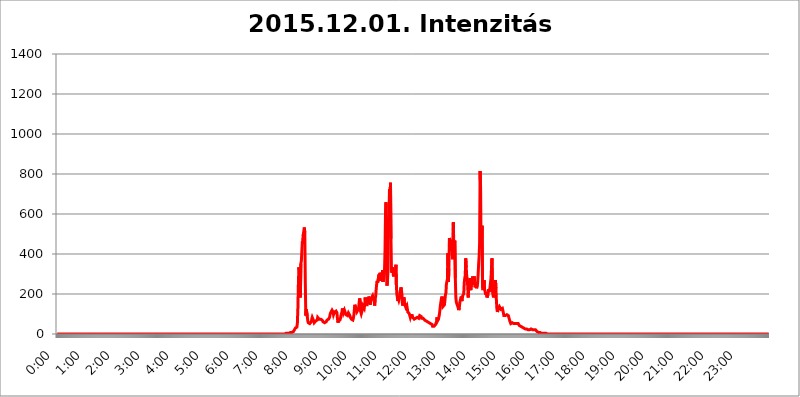
| Category | 2015.12.01. Intenzitás [W/m^2] |
|---|---|
| 0.0 | 0 |
| 0.0006944444444444445 | 0 |
| 0.001388888888888889 | 0 |
| 0.0020833333333333333 | 0 |
| 0.002777777777777778 | 0 |
| 0.003472222222222222 | 0 |
| 0.004166666666666667 | 0 |
| 0.004861111111111111 | 0 |
| 0.005555555555555556 | 0 |
| 0.0062499999999999995 | 0 |
| 0.006944444444444444 | 0 |
| 0.007638888888888889 | 0 |
| 0.008333333333333333 | 0 |
| 0.009027777777777779 | 0 |
| 0.009722222222222222 | 0 |
| 0.010416666666666666 | 0 |
| 0.011111111111111112 | 0 |
| 0.011805555555555555 | 0 |
| 0.012499999999999999 | 0 |
| 0.013194444444444444 | 0 |
| 0.013888888888888888 | 0 |
| 0.014583333333333332 | 0 |
| 0.015277777777777777 | 0 |
| 0.015972222222222224 | 0 |
| 0.016666666666666666 | 0 |
| 0.017361111111111112 | 0 |
| 0.018055555555555557 | 0 |
| 0.01875 | 0 |
| 0.019444444444444445 | 0 |
| 0.02013888888888889 | 0 |
| 0.020833333333333332 | 0 |
| 0.02152777777777778 | 0 |
| 0.022222222222222223 | 0 |
| 0.02291666666666667 | 0 |
| 0.02361111111111111 | 0 |
| 0.024305555555555556 | 0 |
| 0.024999999999999998 | 0 |
| 0.025694444444444447 | 0 |
| 0.02638888888888889 | 0 |
| 0.027083333333333334 | 0 |
| 0.027777777777777776 | 0 |
| 0.02847222222222222 | 0 |
| 0.029166666666666664 | 0 |
| 0.029861111111111113 | 0 |
| 0.030555555555555555 | 0 |
| 0.03125 | 0 |
| 0.03194444444444445 | 0 |
| 0.03263888888888889 | 0 |
| 0.03333333333333333 | 0 |
| 0.034027777777777775 | 0 |
| 0.034722222222222224 | 0 |
| 0.035416666666666666 | 0 |
| 0.036111111111111115 | 0 |
| 0.03680555555555556 | 0 |
| 0.0375 | 0 |
| 0.03819444444444444 | 0 |
| 0.03888888888888889 | 0 |
| 0.03958333333333333 | 0 |
| 0.04027777777777778 | 0 |
| 0.04097222222222222 | 0 |
| 0.041666666666666664 | 0 |
| 0.042361111111111106 | 0 |
| 0.04305555555555556 | 0 |
| 0.043750000000000004 | 0 |
| 0.044444444444444446 | 0 |
| 0.04513888888888889 | 0 |
| 0.04583333333333334 | 0 |
| 0.04652777777777778 | 0 |
| 0.04722222222222222 | 0 |
| 0.04791666666666666 | 0 |
| 0.04861111111111111 | 0 |
| 0.049305555555555554 | 0 |
| 0.049999999999999996 | 0 |
| 0.05069444444444445 | 0 |
| 0.051388888888888894 | 0 |
| 0.052083333333333336 | 0 |
| 0.05277777777777778 | 0 |
| 0.05347222222222222 | 0 |
| 0.05416666666666667 | 0 |
| 0.05486111111111111 | 0 |
| 0.05555555555555555 | 0 |
| 0.05625 | 0 |
| 0.05694444444444444 | 0 |
| 0.057638888888888885 | 0 |
| 0.05833333333333333 | 0 |
| 0.05902777777777778 | 0 |
| 0.059722222222222225 | 0 |
| 0.06041666666666667 | 0 |
| 0.061111111111111116 | 0 |
| 0.06180555555555556 | 0 |
| 0.0625 | 0 |
| 0.06319444444444444 | 0 |
| 0.06388888888888888 | 0 |
| 0.06458333333333334 | 0 |
| 0.06527777777777778 | 0 |
| 0.06597222222222222 | 0 |
| 0.06666666666666667 | 0 |
| 0.06736111111111111 | 0 |
| 0.06805555555555555 | 0 |
| 0.06874999999999999 | 0 |
| 0.06944444444444443 | 0 |
| 0.07013888888888889 | 0 |
| 0.07083333333333333 | 0 |
| 0.07152777777777779 | 0 |
| 0.07222222222222223 | 0 |
| 0.07291666666666667 | 0 |
| 0.07361111111111111 | 0 |
| 0.07430555555555556 | 0 |
| 0.075 | 0 |
| 0.07569444444444444 | 0 |
| 0.0763888888888889 | 0 |
| 0.07708333333333334 | 0 |
| 0.07777777777777778 | 0 |
| 0.07847222222222222 | 0 |
| 0.07916666666666666 | 0 |
| 0.0798611111111111 | 0 |
| 0.08055555555555556 | 0 |
| 0.08125 | 0 |
| 0.08194444444444444 | 0 |
| 0.08263888888888889 | 0 |
| 0.08333333333333333 | 0 |
| 0.08402777777777777 | 0 |
| 0.08472222222222221 | 0 |
| 0.08541666666666665 | 0 |
| 0.08611111111111112 | 0 |
| 0.08680555555555557 | 0 |
| 0.08750000000000001 | 0 |
| 0.08819444444444445 | 0 |
| 0.08888888888888889 | 0 |
| 0.08958333333333333 | 0 |
| 0.09027777777777778 | 0 |
| 0.09097222222222222 | 0 |
| 0.09166666666666667 | 0 |
| 0.09236111111111112 | 0 |
| 0.09305555555555556 | 0 |
| 0.09375 | 0 |
| 0.09444444444444444 | 0 |
| 0.09513888888888888 | 0 |
| 0.09583333333333333 | 0 |
| 0.09652777777777777 | 0 |
| 0.09722222222222222 | 0 |
| 0.09791666666666667 | 0 |
| 0.09861111111111111 | 0 |
| 0.09930555555555555 | 0 |
| 0.09999999999999999 | 0 |
| 0.10069444444444443 | 0 |
| 0.1013888888888889 | 0 |
| 0.10208333333333335 | 0 |
| 0.10277777777777779 | 0 |
| 0.10347222222222223 | 0 |
| 0.10416666666666667 | 0 |
| 0.10486111111111111 | 0 |
| 0.10555555555555556 | 0 |
| 0.10625 | 0 |
| 0.10694444444444444 | 0 |
| 0.1076388888888889 | 0 |
| 0.10833333333333334 | 0 |
| 0.10902777777777778 | 0 |
| 0.10972222222222222 | 0 |
| 0.1111111111111111 | 0 |
| 0.11180555555555556 | 0 |
| 0.11180555555555556 | 0 |
| 0.1125 | 0 |
| 0.11319444444444444 | 0 |
| 0.11388888888888889 | 0 |
| 0.11458333333333333 | 0 |
| 0.11527777777777777 | 0 |
| 0.11597222222222221 | 0 |
| 0.11666666666666665 | 0 |
| 0.1173611111111111 | 0 |
| 0.11805555555555557 | 0 |
| 0.11944444444444445 | 0 |
| 0.12013888888888889 | 0 |
| 0.12083333333333333 | 0 |
| 0.12152777777777778 | 0 |
| 0.12222222222222223 | 0 |
| 0.12291666666666667 | 0 |
| 0.12291666666666667 | 0 |
| 0.12361111111111112 | 0 |
| 0.12430555555555556 | 0 |
| 0.125 | 0 |
| 0.12569444444444444 | 0 |
| 0.12638888888888888 | 0 |
| 0.12708333333333333 | 0 |
| 0.16875 | 0 |
| 0.12847222222222224 | 0 |
| 0.12916666666666668 | 0 |
| 0.12986111111111112 | 0 |
| 0.13055555555555556 | 0 |
| 0.13125 | 0 |
| 0.13194444444444445 | 0 |
| 0.1326388888888889 | 0 |
| 0.13333333333333333 | 0 |
| 0.13402777777777777 | 0 |
| 0.13402777777777777 | 0 |
| 0.13472222222222222 | 0 |
| 0.13541666666666666 | 0 |
| 0.1361111111111111 | 0 |
| 0.13749999999999998 | 0 |
| 0.13819444444444443 | 0 |
| 0.1388888888888889 | 0 |
| 0.13958333333333334 | 0 |
| 0.14027777777777778 | 0 |
| 0.14097222222222222 | 0 |
| 0.14166666666666666 | 0 |
| 0.1423611111111111 | 0 |
| 0.14305555555555557 | 0 |
| 0.14375000000000002 | 0 |
| 0.14444444444444446 | 0 |
| 0.1451388888888889 | 0 |
| 0.1451388888888889 | 0 |
| 0.14652777777777778 | 0 |
| 0.14722222222222223 | 0 |
| 0.14791666666666667 | 0 |
| 0.1486111111111111 | 0 |
| 0.14930555555555555 | 0 |
| 0.15 | 0 |
| 0.15069444444444444 | 0 |
| 0.15138888888888888 | 0 |
| 0.15208333333333332 | 0 |
| 0.15277777777777776 | 0 |
| 0.15347222222222223 | 0 |
| 0.15416666666666667 | 0 |
| 0.15486111111111112 | 0 |
| 0.15555555555555556 | 0 |
| 0.15625 | 0 |
| 0.15694444444444444 | 0 |
| 0.15763888888888888 | 0 |
| 0.15833333333333333 | 0 |
| 0.15902777777777777 | 0 |
| 0.15972222222222224 | 0 |
| 0.16041666666666668 | 0 |
| 0.16111111111111112 | 0 |
| 0.16180555555555556 | 0 |
| 0.1625 | 0 |
| 0.16319444444444445 | 0 |
| 0.1638888888888889 | 0 |
| 0.16458333333333333 | 0 |
| 0.16527777777777777 | 0 |
| 0.16597222222222222 | 0 |
| 0.16666666666666666 | 0 |
| 0.1673611111111111 | 0 |
| 0.16805555555555554 | 0 |
| 0.16874999999999998 | 0 |
| 0.16944444444444443 | 0 |
| 0.17013888888888887 | 0 |
| 0.1708333333333333 | 0 |
| 0.17152777777777775 | 0 |
| 0.17222222222222225 | 0 |
| 0.1729166666666667 | 0 |
| 0.17361111111111113 | 0 |
| 0.17430555555555557 | 0 |
| 0.17500000000000002 | 0 |
| 0.17569444444444446 | 0 |
| 0.1763888888888889 | 0 |
| 0.17708333333333334 | 0 |
| 0.17777777777777778 | 0 |
| 0.17847222222222223 | 0 |
| 0.17916666666666667 | 0 |
| 0.1798611111111111 | 0 |
| 0.18055555555555555 | 0 |
| 0.18125 | 0 |
| 0.18194444444444444 | 0 |
| 0.1826388888888889 | 0 |
| 0.18333333333333335 | 0 |
| 0.1840277777777778 | 0 |
| 0.18472222222222223 | 0 |
| 0.18541666666666667 | 0 |
| 0.18611111111111112 | 0 |
| 0.18680555555555556 | 0 |
| 0.1875 | 0 |
| 0.18819444444444444 | 0 |
| 0.18888888888888888 | 0 |
| 0.18958333333333333 | 0 |
| 0.19027777777777777 | 0 |
| 0.1909722222222222 | 0 |
| 0.19166666666666665 | 0 |
| 0.19236111111111112 | 0 |
| 0.19305555555555554 | 0 |
| 0.19375 | 0 |
| 0.19444444444444445 | 0 |
| 0.1951388888888889 | 0 |
| 0.19583333333333333 | 0 |
| 0.19652777777777777 | 0 |
| 0.19722222222222222 | 0 |
| 0.19791666666666666 | 0 |
| 0.1986111111111111 | 0 |
| 0.19930555555555554 | 0 |
| 0.19999999999999998 | 0 |
| 0.20069444444444443 | 0 |
| 0.20138888888888887 | 0 |
| 0.2020833333333333 | 0 |
| 0.2027777777777778 | 0 |
| 0.2034722222222222 | 0 |
| 0.2041666666666667 | 0 |
| 0.20486111111111113 | 0 |
| 0.20555555555555557 | 0 |
| 0.20625000000000002 | 0 |
| 0.20694444444444446 | 0 |
| 0.2076388888888889 | 0 |
| 0.20833333333333334 | 0 |
| 0.20902777777777778 | 0 |
| 0.20972222222222223 | 0 |
| 0.21041666666666667 | 0 |
| 0.2111111111111111 | 0 |
| 0.21180555555555555 | 0 |
| 0.2125 | 0 |
| 0.21319444444444444 | 0 |
| 0.2138888888888889 | 0 |
| 0.21458333333333335 | 0 |
| 0.2152777777777778 | 0 |
| 0.21597222222222223 | 0 |
| 0.21666666666666667 | 0 |
| 0.21736111111111112 | 0 |
| 0.21805555555555556 | 0 |
| 0.21875 | 0 |
| 0.21944444444444444 | 0 |
| 0.22013888888888888 | 0 |
| 0.22083333333333333 | 0 |
| 0.22152777777777777 | 0 |
| 0.2222222222222222 | 0 |
| 0.22291666666666665 | 0 |
| 0.2236111111111111 | 0 |
| 0.22430555555555556 | 0 |
| 0.225 | 0 |
| 0.22569444444444445 | 0 |
| 0.2263888888888889 | 0 |
| 0.22708333333333333 | 0 |
| 0.22777777777777777 | 0 |
| 0.22847222222222222 | 0 |
| 0.22916666666666666 | 0 |
| 0.2298611111111111 | 0 |
| 0.23055555555555554 | 0 |
| 0.23124999999999998 | 0 |
| 0.23194444444444443 | 0 |
| 0.23263888888888887 | 0 |
| 0.2333333333333333 | 0 |
| 0.2340277777777778 | 0 |
| 0.2347222222222222 | 0 |
| 0.2354166666666667 | 0 |
| 0.23611111111111113 | 0 |
| 0.23680555555555557 | 0 |
| 0.23750000000000002 | 0 |
| 0.23819444444444446 | 0 |
| 0.2388888888888889 | 0 |
| 0.23958333333333334 | 0 |
| 0.24027777777777778 | 0 |
| 0.24097222222222223 | 0 |
| 0.24166666666666667 | 0 |
| 0.2423611111111111 | 0 |
| 0.24305555555555555 | 0 |
| 0.24375 | 0 |
| 0.24444444444444446 | 0 |
| 0.24513888888888888 | 0 |
| 0.24583333333333335 | 0 |
| 0.2465277777777778 | 0 |
| 0.24722222222222223 | 0 |
| 0.24791666666666667 | 0 |
| 0.24861111111111112 | 0 |
| 0.24930555555555556 | 0 |
| 0.25 | 0 |
| 0.25069444444444444 | 0 |
| 0.2513888888888889 | 0 |
| 0.2520833333333333 | 0 |
| 0.25277777777777777 | 0 |
| 0.2534722222222222 | 0 |
| 0.25416666666666665 | 0 |
| 0.2548611111111111 | 0 |
| 0.2555555555555556 | 0 |
| 0.25625000000000003 | 0 |
| 0.2569444444444445 | 0 |
| 0.2576388888888889 | 0 |
| 0.25833333333333336 | 0 |
| 0.2590277777777778 | 0 |
| 0.25972222222222224 | 0 |
| 0.2604166666666667 | 0 |
| 0.2611111111111111 | 0 |
| 0.26180555555555557 | 0 |
| 0.2625 | 0 |
| 0.26319444444444445 | 0 |
| 0.2638888888888889 | 0 |
| 0.26458333333333334 | 0 |
| 0.2652777777777778 | 0 |
| 0.2659722222222222 | 0 |
| 0.26666666666666666 | 0 |
| 0.2673611111111111 | 0 |
| 0.26805555555555555 | 0 |
| 0.26875 | 0 |
| 0.26944444444444443 | 0 |
| 0.2701388888888889 | 0 |
| 0.2708333333333333 | 0 |
| 0.27152777777777776 | 0 |
| 0.2722222222222222 | 0 |
| 0.27291666666666664 | 0 |
| 0.2736111111111111 | 0 |
| 0.2743055555555555 | 0 |
| 0.27499999999999997 | 0 |
| 0.27569444444444446 | 0 |
| 0.27638888888888885 | 0 |
| 0.27708333333333335 | 0 |
| 0.2777777777777778 | 0 |
| 0.27847222222222223 | 0 |
| 0.2791666666666667 | 0 |
| 0.2798611111111111 | 0 |
| 0.28055555555555556 | 0 |
| 0.28125 | 0 |
| 0.28194444444444444 | 0 |
| 0.2826388888888889 | 0 |
| 0.2833333333333333 | 0 |
| 0.28402777777777777 | 0 |
| 0.2847222222222222 | 0 |
| 0.28541666666666665 | 0 |
| 0.28611111111111115 | 0 |
| 0.28680555555555554 | 0 |
| 0.28750000000000003 | 0 |
| 0.2881944444444445 | 0 |
| 0.2888888888888889 | 0 |
| 0.28958333333333336 | 0 |
| 0.2902777777777778 | 0 |
| 0.29097222222222224 | 0 |
| 0.2916666666666667 | 0 |
| 0.2923611111111111 | 0 |
| 0.29305555555555557 | 0 |
| 0.29375 | 0 |
| 0.29444444444444445 | 0 |
| 0.2951388888888889 | 0 |
| 0.29583333333333334 | 0 |
| 0.2965277777777778 | 0 |
| 0.2972222222222222 | 0 |
| 0.29791666666666666 | 0 |
| 0.2986111111111111 | 0 |
| 0.29930555555555555 | 0 |
| 0.3 | 0 |
| 0.30069444444444443 | 0 |
| 0.3013888888888889 | 0 |
| 0.3020833333333333 | 0 |
| 0.30277777777777776 | 0 |
| 0.3034722222222222 | 0 |
| 0.30416666666666664 | 0 |
| 0.3048611111111111 | 0 |
| 0.3055555555555555 | 0 |
| 0.30624999999999997 | 0 |
| 0.3069444444444444 | 0 |
| 0.3076388888888889 | 0 |
| 0.30833333333333335 | 0 |
| 0.3090277777777778 | 0 |
| 0.30972222222222223 | 0 |
| 0.3104166666666667 | 0 |
| 0.3111111111111111 | 0 |
| 0.31180555555555556 | 0 |
| 0.3125 | 0 |
| 0.31319444444444444 | 0 |
| 0.3138888888888889 | 0 |
| 0.3145833333333333 | 0 |
| 0.31527777777777777 | 0 |
| 0.3159722222222222 | 0 |
| 0.31666666666666665 | 0 |
| 0.31736111111111115 | 0 |
| 0.31805555555555554 | 0 |
| 0.31875000000000003 | 0 |
| 0.3194444444444445 | 3.525 |
| 0.3201388888888889 | 3.525 |
| 0.32083333333333336 | 3.525 |
| 0.3215277777777778 | 3.525 |
| 0.32222222222222224 | 3.525 |
| 0.3229166666666667 | 3.525 |
| 0.3236111111111111 | 3.525 |
| 0.32430555555555557 | 3.525 |
| 0.325 | 3.525 |
| 0.32569444444444445 | 7.887 |
| 0.3263888888888889 | 7.887 |
| 0.32708333333333334 | 7.887 |
| 0.3277777777777778 | 7.887 |
| 0.3284722222222222 | 7.887 |
| 0.32916666666666666 | 7.887 |
| 0.3298611111111111 | 12.257 |
| 0.33055555555555555 | 12.257 |
| 0.33125 | 12.257 |
| 0.33194444444444443 | 16.636 |
| 0.3326388888888889 | 21.024 |
| 0.3333333333333333 | 25.419 |
| 0.3340277777777778 | 29.823 |
| 0.3347222222222222 | 29.823 |
| 0.3354166666666667 | 34.234 |
| 0.3361111111111111 | 34.234 |
| 0.3368055555555556 | 56.398 |
| 0.33749999999999997 | 128.284 |
| 0.33819444444444446 | 246.689 |
| 0.33888888888888885 | 333.113 |
| 0.33958333333333335 | 319.517 |
| 0.34027777777777773 | 278.603 |
| 0.34097222222222223 | 182.82 |
| 0.3416666666666666 | 351.198 |
| 0.3423611111111111 | 364.728 |
| 0.3430555555555555 | 414.035 |
| 0.34375 | 462.786 |
| 0.3444444444444445 | 449.551 |
| 0.3451388888888889 | 497.836 |
| 0.3458333333333334 | 515.223 |
| 0.34652777777777777 | 532.513 |
| 0.34722222222222227 | 506.542 |
| 0.34791666666666665 | 255.813 |
| 0.34861111111111115 | 92.184 |
| 0.34930555555555554 | 123.758 |
| 0.35000000000000003 | 119.235 |
| 0.3506944444444444 | 87.692 |
| 0.3513888888888889 | 65.31 |
| 0.3520833333333333 | 56.398 |
| 0.3527777777777778 | 51.951 |
| 0.3534722222222222 | 51.951 |
| 0.3541666666666667 | 51.951 |
| 0.3548611111111111 | 51.951 |
| 0.35555555555555557 | 56.398 |
| 0.35625 | 60.85 |
| 0.35694444444444445 | 74.246 |
| 0.3576388888888889 | 83.205 |
| 0.35833333333333334 | 83.205 |
| 0.3590277777777778 | 78.722 |
| 0.3597222222222222 | 65.31 |
| 0.36041666666666666 | 56.398 |
| 0.3611111111111111 | 56.398 |
| 0.36180555555555555 | 60.85 |
| 0.3625 | 65.31 |
| 0.36319444444444443 | 65.31 |
| 0.3638888888888889 | 60.85 |
| 0.3645833333333333 | 69.775 |
| 0.3652777777777778 | 83.205 |
| 0.3659722222222222 | 87.692 |
| 0.3666666666666667 | 78.722 |
| 0.3673611111111111 | 74.246 |
| 0.3680555555555556 | 74.246 |
| 0.36874999999999997 | 74.246 |
| 0.36944444444444446 | 74.246 |
| 0.37013888888888885 | 74.246 |
| 0.37083333333333335 | 69.775 |
| 0.37152777777777773 | 69.775 |
| 0.37222222222222223 | 65.31 |
| 0.3729166666666666 | 60.85 |
| 0.3736111111111111 | 60.85 |
| 0.3743055555555555 | 60.85 |
| 0.375 | 56.398 |
| 0.3756944444444445 | 56.398 |
| 0.3763888888888889 | 60.85 |
| 0.3770833333333334 | 60.85 |
| 0.37777777777777777 | 65.31 |
| 0.37847222222222227 | 69.775 |
| 0.37916666666666665 | 65.31 |
| 0.37986111111111115 | 69.775 |
| 0.38055555555555554 | 74.246 |
| 0.38125000000000003 | 78.722 |
| 0.3819444444444444 | 83.205 |
| 0.3826388888888889 | 96.682 |
| 0.3833333333333333 | 105.69 |
| 0.3840277777777778 | 105.69 |
| 0.3847222222222222 | 110.201 |
| 0.3854166666666667 | 119.235 |
| 0.3861111111111111 | 123.758 |
| 0.38680555555555557 | 110.201 |
| 0.3875 | 96.682 |
| 0.38819444444444445 | 101.184 |
| 0.3888888888888889 | 110.201 |
| 0.38958333333333334 | 105.69 |
| 0.3902777777777778 | 114.716 |
| 0.3909722222222222 | 114.716 |
| 0.39166666666666666 | 119.235 |
| 0.3923611111111111 | 105.69 |
| 0.39305555555555555 | 74.246 |
| 0.39375 | 56.398 |
| 0.39444444444444443 | 65.31 |
| 0.3951388888888889 | 65.31 |
| 0.3958333333333333 | 65.31 |
| 0.3965277777777778 | 69.775 |
| 0.3972222222222222 | 78.722 |
| 0.3979166666666667 | 92.184 |
| 0.3986111111111111 | 101.184 |
| 0.3993055555555556 | 110.201 |
| 0.39999999999999997 | 128.284 |
| 0.40069444444444446 | 119.235 |
| 0.40138888888888885 | 105.69 |
| 0.40208333333333335 | 110.201 |
| 0.40277777777777773 | 119.235 |
| 0.40347222222222223 | 119.235 |
| 0.4041666666666666 | 114.716 |
| 0.4048611111111111 | 96.682 |
| 0.4055555555555555 | 92.184 |
| 0.40625 | 92.184 |
| 0.4069444444444445 | 92.184 |
| 0.4076388888888889 | 92.184 |
| 0.4083333333333334 | 105.69 |
| 0.40902777777777777 | 105.69 |
| 0.40972222222222227 | 101.184 |
| 0.41041666666666665 | 92.184 |
| 0.41111111111111115 | 83.205 |
| 0.41180555555555554 | 83.205 |
| 0.41250000000000003 | 74.246 |
| 0.4131944444444444 | 74.246 |
| 0.4138888888888889 | 74.246 |
| 0.4145833333333333 | 69.775 |
| 0.4152777777777778 | 78.722 |
| 0.4159722222222222 | 92.184 |
| 0.4166666666666667 | 119.235 |
| 0.4173611111111111 | 146.423 |
| 0.41805555555555557 | 141.884 |
| 0.41875 | 128.284 |
| 0.41944444444444445 | 119.235 |
| 0.4201388888888889 | 128.284 |
| 0.42083333333333334 | 114.716 |
| 0.4215277777777778 | 110.201 |
| 0.4222222222222222 | 123.758 |
| 0.42291666666666666 | 137.347 |
| 0.4236111111111111 | 164.605 |
| 0.42430555555555555 | 178.264 |
| 0.425 | 178.264 |
| 0.42569444444444443 | 110.201 |
| 0.4263888888888889 | 101.184 |
| 0.4270833333333333 | 105.69 |
| 0.4277777777777778 | 119.235 |
| 0.4284722222222222 | 141.884 |
| 0.4291666666666667 | 141.884 |
| 0.4298611111111111 | 137.347 |
| 0.4305555555555556 | 128.284 |
| 0.43124999999999997 | 146.423 |
| 0.43194444444444446 | 182.82 |
| 0.43263888888888885 | 146.423 |
| 0.43333333333333335 | 150.964 |
| 0.43402777777777773 | 141.884 |
| 0.43472222222222223 | 146.423 |
| 0.4354166666666666 | 146.423 |
| 0.4361111111111111 | 169.156 |
| 0.4368055555555555 | 187.378 |
| 0.4375 | 187.378 |
| 0.4381944444444445 | 169.156 |
| 0.4388888888888889 | 146.423 |
| 0.4395833333333334 | 164.605 |
| 0.44027777777777777 | 169.156 |
| 0.44097222222222227 | 182.82 |
| 0.44166666666666665 | 182.82 |
| 0.44236111111111115 | 191.937 |
| 0.44305555555555554 | 196.497 |
| 0.44375000000000003 | 191.937 |
| 0.4444444444444444 | 164.605 |
| 0.4451388888888889 | 141.884 |
| 0.4458333333333333 | 173.709 |
| 0.4465277777777778 | 187.378 |
| 0.4472222222222222 | 219.309 |
| 0.4479166666666667 | 246.689 |
| 0.4486111111111111 | 264.932 |
| 0.44930555555555557 | 255.813 |
| 0.45 | 251.251 |
| 0.45069444444444445 | 260.373 |
| 0.4513888888888889 | 296.808 |
| 0.45208333333333334 | 264.932 |
| 0.4527777777777778 | 305.898 |
| 0.4534722222222222 | 301.354 |
| 0.45416666666666666 | 264.932 |
| 0.4548611111111111 | 274.047 |
| 0.45555555555555555 | 292.259 |
| 0.45625 | 319.517 |
| 0.45694444444444443 | 260.373 |
| 0.4576388888888889 | 283.156 |
| 0.4583333333333333 | 301.354 |
| 0.4590277777777778 | 319.517 |
| 0.4597222222222222 | 418.492 |
| 0.4604166666666667 | 609.062 |
| 0.4611111111111111 | 658.909 |
| 0.4618055555555556 | 310.44 |
| 0.46249999999999997 | 242.127 |
| 0.46319444444444446 | 269.49 |
| 0.46388888888888885 | 314.98 |
| 0.46458333333333335 | 575.299 |
| 0.46527777777777773 | 592.233 |
| 0.46597222222222223 | 723.889 |
| 0.4666666666666666 | 654.791 |
| 0.4673611111111111 | 755.766 |
| 0.4680555555555555 | 475.972 |
| 0.46875 | 319.517 |
| 0.4694444444444445 | 305.898 |
| 0.4701388888888889 | 333.113 |
| 0.4708333333333334 | 314.98 |
| 0.47152777777777777 | 287.709 |
| 0.47222222222222227 | 310.44 |
| 0.47291666666666665 | 324.052 |
| 0.47361111111111115 | 292.259 |
| 0.47430555555555554 | 305.898 |
| 0.47500000000000003 | 346.682 |
| 0.4756944444444444 | 237.564 |
| 0.4763888888888889 | 196.497 |
| 0.4770833333333333 | 182.82 |
| 0.4777777777777778 | 164.605 |
| 0.4784722222222222 | 178.264 |
| 0.4791666666666667 | 169.156 |
| 0.4798611111111111 | 178.264 |
| 0.48055555555555557 | 205.62 |
| 0.48125 | 214.746 |
| 0.48194444444444445 | 233 |
| 0.4826388888888889 | 223.873 |
| 0.48333333333333334 | 201.058 |
| 0.4840277777777778 | 155.509 |
| 0.4847222222222222 | 141.884 |
| 0.48541666666666666 | 141.884 |
| 0.4861111111111111 | 182.82 |
| 0.48680555555555555 | 164.605 |
| 0.4875 | 146.423 |
| 0.48819444444444443 | 141.884 |
| 0.4888888888888889 | 132.814 |
| 0.4895833333333333 | 128.284 |
| 0.4902777777777778 | 141.884 |
| 0.4909722222222222 | 146.423 |
| 0.4916666666666667 | 110.201 |
| 0.4923611111111111 | 110.201 |
| 0.4930555555555556 | 105.69 |
| 0.49374999999999997 | 101.184 |
| 0.49444444444444446 | 92.184 |
| 0.49513888888888885 | 83.205 |
| 0.49583333333333335 | 92.184 |
| 0.49652777777777773 | 92.184 |
| 0.49722222222222223 | 92.184 |
| 0.4979166666666666 | 92.184 |
| 0.4986111111111111 | 83.205 |
| 0.4993055555555555 | 87.692 |
| 0.5 | 83.205 |
| 0.5006944444444444 | 74.246 |
| 0.5013888888888889 | 74.246 |
| 0.5020833333333333 | 74.246 |
| 0.5027777777777778 | 78.722 |
| 0.5034722222222222 | 74.246 |
| 0.5041666666666667 | 78.722 |
| 0.5048611111111111 | 83.205 |
| 0.5055555555555555 | 83.205 |
| 0.50625 | 78.722 |
| 0.5069444444444444 | 78.722 |
| 0.5076388888888889 | 83.205 |
| 0.5083333333333333 | 92.184 |
| 0.5090277777777777 | 92.184 |
| 0.5097222222222222 | 92.184 |
| 0.5104166666666666 | 87.692 |
| 0.5111111111111112 | 78.722 |
| 0.5118055555555555 | 74.246 |
| 0.5125000000000001 | 78.722 |
| 0.5131944444444444 | 78.722 |
| 0.513888888888889 | 78.722 |
| 0.5145833333333333 | 74.246 |
| 0.5152777777777778 | 69.775 |
| 0.5159722222222222 | 69.775 |
| 0.5166666666666667 | 69.775 |
| 0.517361111111111 | 65.31 |
| 0.5180555555555556 | 65.31 |
| 0.5187499999999999 | 65.31 |
| 0.5194444444444445 | 60.85 |
| 0.5201388888888888 | 56.398 |
| 0.5208333333333334 | 56.398 |
| 0.5215277777777778 | 56.398 |
| 0.5222222222222223 | 60.85 |
| 0.5229166666666667 | 51.951 |
| 0.5236111111111111 | 51.951 |
| 0.5243055555555556 | 51.951 |
| 0.525 | 47.511 |
| 0.5256944444444445 | 47.511 |
| 0.5263888888888889 | 38.653 |
| 0.5270833333333333 | 38.653 |
| 0.5277777777777778 | 38.653 |
| 0.5284722222222222 | 38.653 |
| 0.5291666666666667 | 38.653 |
| 0.5298611111111111 | 38.653 |
| 0.5305555555555556 | 47.511 |
| 0.53125 | 51.951 |
| 0.5319444444444444 | 60.85 |
| 0.5326388888888889 | 83.205 |
| 0.5333333333333333 | 65.31 |
| 0.5340277777777778 | 60.85 |
| 0.5347222222222222 | 74.246 |
| 0.5354166666666667 | 78.722 |
| 0.5361111111111111 | 101.184 |
| 0.5368055555555555 | 123.758 |
| 0.5375 | 146.423 |
| 0.5381944444444444 | 146.423 |
| 0.5388888888888889 | 178.264 |
| 0.5395833333333333 | 187.378 |
| 0.5402777777777777 | 173.709 |
| 0.5409722222222222 | 137.347 |
| 0.5416666666666666 | 141.884 |
| 0.5423611111111112 | 141.884 |
| 0.5430555555555555 | 146.423 |
| 0.5437500000000001 | 169.156 |
| 0.5444444444444444 | 196.497 |
| 0.545138888888889 | 205.62 |
| 0.5458333333333333 | 251.251 |
| 0.5465277777777778 | 251.251 |
| 0.5472222222222222 | 274.047 |
| 0.5479166666666667 | 405.108 |
| 0.548611111111111 | 260.373 |
| 0.5493055555555556 | 324.052 |
| 0.5499999999999999 | 480.356 |
| 0.5506944444444445 | 449.551 |
| 0.5513888888888888 | 418.492 |
| 0.5520833333333334 | 471.582 |
| 0.5527777777777778 | 418.492 |
| 0.5534722222222223 | 427.39 |
| 0.5541666666666667 | 391.685 |
| 0.5548611111111111 | 373.729 |
| 0.5555555555555556 | 558.261 |
| 0.55625 | 387.202 |
| 0.5569444444444445 | 458.38 |
| 0.5576388888888889 | 467.187 |
| 0.5583333333333333 | 278.603 |
| 0.5590277777777778 | 182.82 |
| 0.5597222222222222 | 160.056 |
| 0.5604166666666667 | 150.964 |
| 0.5611111111111111 | 146.423 |
| 0.5618055555555556 | 137.347 |
| 0.5625 | 128.284 |
| 0.5631944444444444 | 119.235 |
| 0.5638888888888889 | 132.814 |
| 0.5645833333333333 | 155.509 |
| 0.5652777777777778 | 169.156 |
| 0.5659722222222222 | 173.709 |
| 0.5666666666666667 | 187.378 |
| 0.5673611111111111 | 164.605 |
| 0.5680555555555555 | 178.264 |
| 0.56875 | 191.937 |
| 0.5694444444444444 | 191.937 |
| 0.5701388888888889 | 201.058 |
| 0.5708333333333333 | 255.813 |
| 0.5715277777777777 | 278.603 |
| 0.5722222222222222 | 292.259 |
| 0.5729166666666666 | 378.224 |
| 0.5736111111111112 | 333.113 |
| 0.5743055555555555 | 287.709 |
| 0.5750000000000001 | 278.603 |
| 0.5756944444444444 | 237.564 |
| 0.576388888888889 | 182.82 |
| 0.5770833333333333 | 242.127 |
| 0.5777777777777778 | 246.689 |
| 0.5784722222222222 | 228.436 |
| 0.5791666666666667 | 278.603 |
| 0.579861111111111 | 219.309 |
| 0.5805555555555556 | 214.746 |
| 0.5812499999999999 | 255.813 |
| 0.5819444444444445 | 269.49 |
| 0.5826388888888888 | 287.709 |
| 0.5833333333333334 | 246.689 |
| 0.5840277777777778 | 260.373 |
| 0.5847222222222223 | 287.709 |
| 0.5854166666666667 | 264.932 |
| 0.5861111111111111 | 233 |
| 0.5868055555555556 | 255.813 |
| 0.5875 | 246.689 |
| 0.5881944444444445 | 228.436 |
| 0.5888888888888889 | 233 |
| 0.5895833333333333 | 255.813 |
| 0.5902777777777778 | 296.808 |
| 0.5909722222222222 | 346.682 |
| 0.5916666666666667 | 387.202 |
| 0.5923611111111111 | 453.968 |
| 0.5930555555555556 | 814.519 |
| 0.59375 | 735.89 |
| 0.5944444444444444 | 431.833 |
| 0.5951388888888889 | 431.833 |
| 0.5958333333333333 | 541.121 |
| 0.5965277777777778 | 233 |
| 0.5972222222222222 | 219.309 |
| 0.5979166666666667 | 223.873 |
| 0.5986111111111111 | 269.49 |
| 0.5993055555555555 | 223.873 |
| 0.6 | 214.746 |
| 0.6006944444444444 | 196.497 |
| 0.6013888888888889 | 201.058 |
| 0.6020833333333333 | 210.182 |
| 0.6027777777777777 | 182.82 |
| 0.6034722222222222 | 178.264 |
| 0.6041666666666666 | 196.497 |
| 0.6048611111111112 | 223.873 |
| 0.6055555555555555 | 210.182 |
| 0.6062500000000001 | 219.309 |
| 0.6069444444444444 | 233 |
| 0.607638888888889 | 237.564 |
| 0.6083333333333333 | 278.603 |
| 0.6090277777777778 | 283.156 |
| 0.6097222222222222 | 378.224 |
| 0.6104166666666667 | 214.746 |
| 0.611111111111111 | 196.497 |
| 0.6118055555555556 | 182.82 |
| 0.6124999999999999 | 191.937 |
| 0.6131944444444445 | 196.497 |
| 0.6138888888888888 | 237.564 |
| 0.6145833333333334 | 269.49 |
| 0.6152777777777778 | 228.436 |
| 0.6159722222222223 | 164.605 |
| 0.6166666666666667 | 123.758 |
| 0.6173611111111111 | 110.201 |
| 0.6180555555555556 | 119.235 |
| 0.61875 | 128.284 |
| 0.6194444444444445 | 132.814 |
| 0.6201388888888889 | 137.347 |
| 0.6208333333333333 | 141.884 |
| 0.6215277777777778 | 137.347 |
| 0.6222222222222222 | 123.758 |
| 0.6229166666666667 | 123.758 |
| 0.6236111111111111 | 128.284 |
| 0.6243055555555556 | 128.284 |
| 0.625 | 123.758 |
| 0.6256944444444444 | 105.69 |
| 0.6263888888888889 | 92.184 |
| 0.6270833333333333 | 87.692 |
| 0.6277777777777778 | 87.692 |
| 0.6284722222222222 | 92.184 |
| 0.6291666666666667 | 92.184 |
| 0.6298611111111111 | 92.184 |
| 0.6305555555555555 | 96.682 |
| 0.63125 | 96.682 |
| 0.6319444444444444 | 92.184 |
| 0.6326388888888889 | 92.184 |
| 0.6333333333333333 | 83.205 |
| 0.6340277777777777 | 74.246 |
| 0.6347222222222222 | 65.31 |
| 0.6354166666666666 | 60.85 |
| 0.6361111111111112 | 51.951 |
| 0.6368055555555555 | 51.951 |
| 0.6375000000000001 | 51.951 |
| 0.6381944444444444 | 56.398 |
| 0.638888888888889 | 56.398 |
| 0.6395833333333333 | 51.951 |
| 0.6402777777777778 | 51.951 |
| 0.6409722222222222 | 51.951 |
| 0.6416666666666667 | 51.951 |
| 0.642361111111111 | 51.951 |
| 0.6430555555555556 | 51.951 |
| 0.6437499999999999 | 51.951 |
| 0.6444444444444445 | 51.951 |
| 0.6451388888888888 | 51.951 |
| 0.6458333333333334 | 51.951 |
| 0.6465277777777778 | 51.951 |
| 0.6472222222222223 | 47.511 |
| 0.6479166666666667 | 43.079 |
| 0.6486111111111111 | 43.079 |
| 0.6493055555555556 | 38.653 |
| 0.65 | 38.653 |
| 0.6506944444444445 | 38.653 |
| 0.6513888888888889 | 34.234 |
| 0.6520833333333333 | 34.234 |
| 0.6527777777777778 | 29.823 |
| 0.6534722222222222 | 29.823 |
| 0.6541666666666667 | 29.823 |
| 0.6548611111111111 | 25.419 |
| 0.6555555555555556 | 25.419 |
| 0.65625 | 25.419 |
| 0.6569444444444444 | 25.419 |
| 0.6576388888888889 | 25.419 |
| 0.6583333333333333 | 25.419 |
| 0.6590277777777778 | 25.419 |
| 0.6597222222222222 | 25.419 |
| 0.6604166666666667 | 21.024 |
| 0.6611111111111111 | 21.024 |
| 0.6618055555555555 | 21.024 |
| 0.6625 | 21.024 |
| 0.6631944444444444 | 21.024 |
| 0.6638888888888889 | 25.419 |
| 0.6645833333333333 | 25.419 |
| 0.6652777777777777 | 25.419 |
| 0.6659722222222222 | 25.419 |
| 0.6666666666666666 | 21.024 |
| 0.6673611111111111 | 21.024 |
| 0.6680555555555556 | 21.024 |
| 0.6687500000000001 | 21.024 |
| 0.6694444444444444 | 21.024 |
| 0.6701388888888888 | 21.024 |
| 0.6708333333333334 | 21.024 |
| 0.6715277777777778 | 16.636 |
| 0.6722222222222222 | 16.636 |
| 0.6729166666666666 | 12.257 |
| 0.6736111111111112 | 12.257 |
| 0.6743055555555556 | 12.257 |
| 0.6749999999999999 | 7.887 |
| 0.6756944444444444 | 7.887 |
| 0.6763888888888889 | 7.887 |
| 0.6770833333333334 | 7.887 |
| 0.6777777777777777 | 7.887 |
| 0.6784722222222223 | 7.887 |
| 0.6791666666666667 | 3.525 |
| 0.6798611111111111 | 3.525 |
| 0.6805555555555555 | 3.525 |
| 0.68125 | 3.525 |
| 0.6819444444444445 | 3.525 |
| 0.6826388888888889 | 3.525 |
| 0.6833333333333332 | 3.525 |
| 0.6840277777777778 | 3.525 |
| 0.6847222222222222 | 3.525 |
| 0.6854166666666667 | 3.525 |
| 0.686111111111111 | 0 |
| 0.6868055555555556 | 0 |
| 0.6875 | 0 |
| 0.6881944444444444 | 0 |
| 0.688888888888889 | 0 |
| 0.6895833333333333 | 0 |
| 0.6902777777777778 | 0 |
| 0.6909722222222222 | 0 |
| 0.6916666666666668 | 0 |
| 0.6923611111111111 | 0 |
| 0.6930555555555555 | 0 |
| 0.69375 | 0 |
| 0.6944444444444445 | 0 |
| 0.6951388888888889 | 0 |
| 0.6958333333333333 | 0 |
| 0.6965277777777777 | 0 |
| 0.6972222222222223 | 0 |
| 0.6979166666666666 | 0 |
| 0.6986111111111111 | 0 |
| 0.6993055555555556 | 0 |
| 0.7000000000000001 | 0 |
| 0.7006944444444444 | 0 |
| 0.7013888888888888 | 0 |
| 0.7020833333333334 | 0 |
| 0.7027777777777778 | 0 |
| 0.7034722222222222 | 0 |
| 0.7041666666666666 | 0 |
| 0.7048611111111112 | 0 |
| 0.7055555555555556 | 0 |
| 0.7062499999999999 | 0 |
| 0.7069444444444444 | 0 |
| 0.7076388888888889 | 0 |
| 0.7083333333333334 | 0 |
| 0.7090277777777777 | 0 |
| 0.7097222222222223 | 0 |
| 0.7104166666666667 | 0 |
| 0.7111111111111111 | 0 |
| 0.7118055555555555 | 0 |
| 0.7125 | 0 |
| 0.7131944444444445 | 0 |
| 0.7138888888888889 | 0 |
| 0.7145833333333332 | 0 |
| 0.7152777777777778 | 0 |
| 0.7159722222222222 | 0 |
| 0.7166666666666667 | 0 |
| 0.717361111111111 | 0 |
| 0.7180555555555556 | 0 |
| 0.71875 | 0 |
| 0.7194444444444444 | 0 |
| 0.720138888888889 | 0 |
| 0.7208333333333333 | 0 |
| 0.7215277777777778 | 0 |
| 0.7222222222222222 | 0 |
| 0.7229166666666668 | 0 |
| 0.7236111111111111 | 0 |
| 0.7243055555555555 | 0 |
| 0.725 | 0 |
| 0.7256944444444445 | 0 |
| 0.7263888888888889 | 0 |
| 0.7270833333333333 | 0 |
| 0.7277777777777777 | 0 |
| 0.7284722222222223 | 0 |
| 0.7291666666666666 | 0 |
| 0.7298611111111111 | 0 |
| 0.7305555555555556 | 0 |
| 0.7312500000000001 | 0 |
| 0.7319444444444444 | 0 |
| 0.7326388888888888 | 0 |
| 0.7333333333333334 | 0 |
| 0.7340277777777778 | 0 |
| 0.7347222222222222 | 0 |
| 0.7354166666666666 | 0 |
| 0.7361111111111112 | 0 |
| 0.7368055555555556 | 0 |
| 0.7374999999999999 | 0 |
| 0.7381944444444444 | 0 |
| 0.7388888888888889 | 0 |
| 0.7395833333333334 | 0 |
| 0.7402777777777777 | 0 |
| 0.7409722222222223 | 0 |
| 0.7416666666666667 | 0 |
| 0.7423611111111111 | 0 |
| 0.7430555555555555 | 0 |
| 0.74375 | 0 |
| 0.7444444444444445 | 0 |
| 0.7451388888888889 | 0 |
| 0.7458333333333332 | 0 |
| 0.7465277777777778 | 0 |
| 0.7472222222222222 | 0 |
| 0.7479166666666667 | 0 |
| 0.748611111111111 | 0 |
| 0.7493055555555556 | 0 |
| 0.75 | 0 |
| 0.7506944444444444 | 0 |
| 0.751388888888889 | 0 |
| 0.7520833333333333 | 0 |
| 0.7527777777777778 | 0 |
| 0.7534722222222222 | 0 |
| 0.7541666666666668 | 0 |
| 0.7548611111111111 | 0 |
| 0.7555555555555555 | 0 |
| 0.75625 | 0 |
| 0.7569444444444445 | 0 |
| 0.7576388888888889 | 0 |
| 0.7583333333333333 | 0 |
| 0.7590277777777777 | 0 |
| 0.7597222222222223 | 0 |
| 0.7604166666666666 | 0 |
| 0.7611111111111111 | 0 |
| 0.7618055555555556 | 0 |
| 0.7625000000000001 | 0 |
| 0.7631944444444444 | 0 |
| 0.7638888888888888 | 0 |
| 0.7645833333333334 | 0 |
| 0.7652777777777778 | 0 |
| 0.7659722222222222 | 0 |
| 0.7666666666666666 | 0 |
| 0.7673611111111112 | 0 |
| 0.7680555555555556 | 0 |
| 0.7687499999999999 | 0 |
| 0.7694444444444444 | 0 |
| 0.7701388888888889 | 0 |
| 0.7708333333333334 | 0 |
| 0.7715277777777777 | 0 |
| 0.7722222222222223 | 0 |
| 0.7729166666666667 | 0 |
| 0.7736111111111111 | 0 |
| 0.7743055555555555 | 0 |
| 0.775 | 0 |
| 0.7756944444444445 | 0 |
| 0.7763888888888889 | 0 |
| 0.7770833333333332 | 0 |
| 0.7777777777777778 | 0 |
| 0.7784722222222222 | 0 |
| 0.7791666666666667 | 0 |
| 0.779861111111111 | 0 |
| 0.7805555555555556 | 0 |
| 0.78125 | 0 |
| 0.7819444444444444 | 0 |
| 0.782638888888889 | 0 |
| 0.7833333333333333 | 0 |
| 0.7840277777777778 | 0 |
| 0.7847222222222222 | 0 |
| 0.7854166666666668 | 0 |
| 0.7861111111111111 | 0 |
| 0.7868055555555555 | 0 |
| 0.7875 | 0 |
| 0.7881944444444445 | 0 |
| 0.7888888888888889 | 0 |
| 0.7895833333333333 | 0 |
| 0.7902777777777777 | 0 |
| 0.7909722222222223 | 0 |
| 0.7916666666666666 | 0 |
| 0.7923611111111111 | 0 |
| 0.7930555555555556 | 0 |
| 0.7937500000000001 | 0 |
| 0.7944444444444444 | 0 |
| 0.7951388888888888 | 0 |
| 0.7958333333333334 | 0 |
| 0.7965277777777778 | 0 |
| 0.7972222222222222 | 0 |
| 0.7979166666666666 | 0 |
| 0.7986111111111112 | 0 |
| 0.7993055555555556 | 0 |
| 0.7999999999999999 | 0 |
| 0.8006944444444444 | 0 |
| 0.8013888888888889 | 0 |
| 0.8020833333333334 | 0 |
| 0.8027777777777777 | 0 |
| 0.8034722222222223 | 0 |
| 0.8041666666666667 | 0 |
| 0.8048611111111111 | 0 |
| 0.8055555555555555 | 0 |
| 0.80625 | 0 |
| 0.8069444444444445 | 0 |
| 0.8076388888888889 | 0 |
| 0.8083333333333332 | 0 |
| 0.8090277777777778 | 0 |
| 0.8097222222222222 | 0 |
| 0.8104166666666667 | 0 |
| 0.811111111111111 | 0 |
| 0.8118055555555556 | 0 |
| 0.8125 | 0 |
| 0.8131944444444444 | 0 |
| 0.813888888888889 | 0 |
| 0.8145833333333333 | 0 |
| 0.8152777777777778 | 0 |
| 0.8159722222222222 | 0 |
| 0.8166666666666668 | 0 |
| 0.8173611111111111 | 0 |
| 0.8180555555555555 | 0 |
| 0.81875 | 0 |
| 0.8194444444444445 | 0 |
| 0.8201388888888889 | 0 |
| 0.8208333333333333 | 0 |
| 0.8215277777777777 | 0 |
| 0.8222222222222223 | 0 |
| 0.8229166666666666 | 0 |
| 0.8236111111111111 | 0 |
| 0.8243055555555556 | 0 |
| 0.8250000000000001 | 0 |
| 0.8256944444444444 | 0 |
| 0.8263888888888888 | 0 |
| 0.8270833333333334 | 0 |
| 0.8277777777777778 | 0 |
| 0.8284722222222222 | 0 |
| 0.8291666666666666 | 0 |
| 0.8298611111111112 | 0 |
| 0.8305555555555556 | 0 |
| 0.8312499999999999 | 0 |
| 0.8319444444444444 | 0 |
| 0.8326388888888889 | 0 |
| 0.8333333333333334 | 0 |
| 0.8340277777777777 | 0 |
| 0.8347222222222223 | 0 |
| 0.8354166666666667 | 0 |
| 0.8361111111111111 | 0 |
| 0.8368055555555555 | 0 |
| 0.8375 | 0 |
| 0.8381944444444445 | 0 |
| 0.8388888888888889 | 0 |
| 0.8395833333333332 | 0 |
| 0.8402777777777778 | 0 |
| 0.8409722222222222 | 0 |
| 0.8416666666666667 | 0 |
| 0.842361111111111 | 0 |
| 0.8430555555555556 | 0 |
| 0.84375 | 0 |
| 0.8444444444444444 | 0 |
| 0.845138888888889 | 0 |
| 0.8458333333333333 | 0 |
| 0.8465277777777778 | 0 |
| 0.8472222222222222 | 0 |
| 0.8479166666666668 | 0 |
| 0.8486111111111111 | 0 |
| 0.8493055555555555 | 0 |
| 0.85 | 0 |
| 0.8506944444444445 | 0 |
| 0.8513888888888889 | 0 |
| 0.8520833333333333 | 0 |
| 0.8527777777777777 | 0 |
| 0.8534722222222223 | 0 |
| 0.8541666666666666 | 0 |
| 0.8548611111111111 | 0 |
| 0.8555555555555556 | 0 |
| 0.8562500000000001 | 0 |
| 0.8569444444444444 | 0 |
| 0.8576388888888888 | 0 |
| 0.8583333333333334 | 0 |
| 0.8590277777777778 | 0 |
| 0.8597222222222222 | 0 |
| 0.8604166666666666 | 0 |
| 0.8611111111111112 | 0 |
| 0.8618055555555556 | 0 |
| 0.8624999999999999 | 0 |
| 0.8631944444444444 | 0 |
| 0.8638888888888889 | 0 |
| 0.8645833333333334 | 0 |
| 0.8652777777777777 | 0 |
| 0.8659722222222223 | 0 |
| 0.8666666666666667 | 0 |
| 0.8673611111111111 | 0 |
| 0.8680555555555555 | 0 |
| 0.86875 | 0 |
| 0.8694444444444445 | 0 |
| 0.8701388888888889 | 0 |
| 0.8708333333333332 | 0 |
| 0.8715277777777778 | 0 |
| 0.8722222222222222 | 0 |
| 0.8729166666666667 | 0 |
| 0.873611111111111 | 0 |
| 0.8743055555555556 | 0 |
| 0.875 | 0 |
| 0.8756944444444444 | 0 |
| 0.876388888888889 | 0 |
| 0.8770833333333333 | 0 |
| 0.8777777777777778 | 0 |
| 0.8784722222222222 | 0 |
| 0.8791666666666668 | 0 |
| 0.8798611111111111 | 0 |
| 0.8805555555555555 | 0 |
| 0.88125 | 0 |
| 0.8819444444444445 | 0 |
| 0.8826388888888889 | 0 |
| 0.8833333333333333 | 0 |
| 0.8840277777777777 | 0 |
| 0.8847222222222223 | 0 |
| 0.8854166666666666 | 0 |
| 0.8861111111111111 | 0 |
| 0.8868055555555556 | 0 |
| 0.8875000000000001 | 0 |
| 0.8881944444444444 | 0 |
| 0.8888888888888888 | 0 |
| 0.8895833333333334 | 0 |
| 0.8902777777777778 | 0 |
| 0.8909722222222222 | 0 |
| 0.8916666666666666 | 0 |
| 0.8923611111111112 | 0 |
| 0.8930555555555556 | 0 |
| 0.8937499999999999 | 0 |
| 0.8944444444444444 | 0 |
| 0.8951388888888889 | 0 |
| 0.8958333333333334 | 0 |
| 0.8965277777777777 | 0 |
| 0.8972222222222223 | 0 |
| 0.8979166666666667 | 0 |
| 0.8986111111111111 | 0 |
| 0.8993055555555555 | 0 |
| 0.9 | 0 |
| 0.9006944444444445 | 0 |
| 0.9013888888888889 | 0 |
| 0.9020833333333332 | 0 |
| 0.9027777777777778 | 0 |
| 0.9034722222222222 | 0 |
| 0.9041666666666667 | 0 |
| 0.904861111111111 | 0 |
| 0.9055555555555556 | 0 |
| 0.90625 | 0 |
| 0.9069444444444444 | 0 |
| 0.907638888888889 | 0 |
| 0.9083333333333333 | 0 |
| 0.9090277777777778 | 0 |
| 0.9097222222222222 | 0 |
| 0.9104166666666668 | 0 |
| 0.9111111111111111 | 0 |
| 0.9118055555555555 | 0 |
| 0.9125 | 0 |
| 0.9131944444444445 | 0 |
| 0.9138888888888889 | 0 |
| 0.9145833333333333 | 0 |
| 0.9152777777777777 | 0 |
| 0.9159722222222223 | 0 |
| 0.9166666666666666 | 0 |
| 0.9173611111111111 | 0 |
| 0.9180555555555556 | 0 |
| 0.9187500000000001 | 0 |
| 0.9194444444444444 | 0 |
| 0.9201388888888888 | 0 |
| 0.9208333333333334 | 0 |
| 0.9215277777777778 | 0 |
| 0.9222222222222222 | 0 |
| 0.9229166666666666 | 0 |
| 0.9236111111111112 | 0 |
| 0.9243055555555556 | 0 |
| 0.9249999999999999 | 0 |
| 0.9256944444444444 | 0 |
| 0.9263888888888889 | 0 |
| 0.9270833333333334 | 0 |
| 0.9277777777777777 | 0 |
| 0.9284722222222223 | 0 |
| 0.9291666666666667 | 0 |
| 0.9298611111111111 | 0 |
| 0.9305555555555555 | 0 |
| 0.93125 | 0 |
| 0.9319444444444445 | 0 |
| 0.9326388888888889 | 0 |
| 0.9333333333333332 | 0 |
| 0.9340277777777778 | 0 |
| 0.9347222222222222 | 0 |
| 0.9354166666666667 | 0 |
| 0.936111111111111 | 0 |
| 0.9368055555555556 | 0 |
| 0.9375 | 0 |
| 0.9381944444444444 | 0 |
| 0.938888888888889 | 0 |
| 0.9395833333333333 | 0 |
| 0.9402777777777778 | 0 |
| 0.9409722222222222 | 0 |
| 0.9416666666666668 | 0 |
| 0.9423611111111111 | 0 |
| 0.9430555555555555 | 0 |
| 0.94375 | 0 |
| 0.9444444444444445 | 0 |
| 0.9451388888888889 | 0 |
| 0.9458333333333333 | 0 |
| 0.9465277777777777 | 0 |
| 0.9472222222222223 | 0 |
| 0.9479166666666666 | 0 |
| 0.9486111111111111 | 0 |
| 0.9493055555555556 | 0 |
| 0.9500000000000001 | 0 |
| 0.9506944444444444 | 0 |
| 0.9513888888888888 | 0 |
| 0.9520833333333334 | 0 |
| 0.9527777777777778 | 0 |
| 0.9534722222222222 | 0 |
| 0.9541666666666666 | 0 |
| 0.9548611111111112 | 0 |
| 0.9555555555555556 | 0 |
| 0.9562499999999999 | 0 |
| 0.9569444444444444 | 0 |
| 0.9576388888888889 | 0 |
| 0.9583333333333334 | 0 |
| 0.9590277777777777 | 0 |
| 0.9597222222222223 | 0 |
| 0.9604166666666667 | 0 |
| 0.9611111111111111 | 0 |
| 0.9618055555555555 | 0 |
| 0.9625 | 0 |
| 0.9631944444444445 | 0 |
| 0.9638888888888889 | 0 |
| 0.9645833333333332 | 0 |
| 0.9652777777777778 | 0 |
| 0.9659722222222222 | 0 |
| 0.9666666666666667 | 0 |
| 0.967361111111111 | 0 |
| 0.9680555555555556 | 0 |
| 0.96875 | 0 |
| 0.9694444444444444 | 0 |
| 0.970138888888889 | 0 |
| 0.9708333333333333 | 0 |
| 0.9715277777777778 | 0 |
| 0.9722222222222222 | 0 |
| 0.9729166666666668 | 0 |
| 0.9736111111111111 | 0 |
| 0.9743055555555555 | 0 |
| 0.975 | 0 |
| 0.9756944444444445 | 0 |
| 0.9763888888888889 | 0 |
| 0.9770833333333333 | 0 |
| 0.9777777777777777 | 0 |
| 0.9784722222222223 | 0 |
| 0.9791666666666666 | 0 |
| 0.9798611111111111 | 0 |
| 0.9805555555555556 | 0 |
| 0.9812500000000001 | 0 |
| 0.9819444444444444 | 0 |
| 0.9826388888888888 | 0 |
| 0.9833333333333334 | 0 |
| 0.9840277777777778 | 0 |
| 0.9847222222222222 | 0 |
| 0.9854166666666666 | 0 |
| 0.9861111111111112 | 0 |
| 0.9868055555555556 | 0 |
| 0.9874999999999999 | 0 |
| 0.9881944444444444 | 0 |
| 0.9888888888888889 | 0 |
| 0.9895833333333334 | 0 |
| 0.9902777777777777 | 0 |
| 0.9909722222222223 | 0 |
| 0.9916666666666667 | 0 |
| 0.9923611111111111 | 0 |
| 0.9930555555555555 | 0 |
| 0.99375 | 0 |
| 0.9944444444444445 | 0 |
| 0.9951388888888889 | 0 |
| 0.9958333333333332 | 0 |
| 0.9965277777777778 | 0 |
| 0.9972222222222222 | 0 |
| 0.9979166666666667 | 0 |
| 0.998611111111111 | 0 |
| 0.9993055555555556 | 0 |